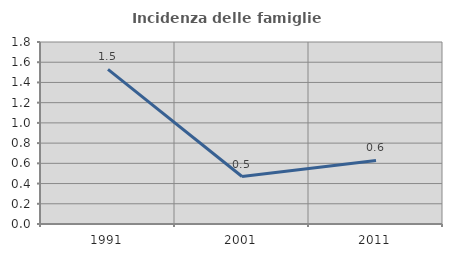
| Category | Incidenza delle famiglie numerose |
|---|---|
| 1991.0 | 1.529 |
| 2001.0 | 0.47 |
| 2011.0 | 0.628 |